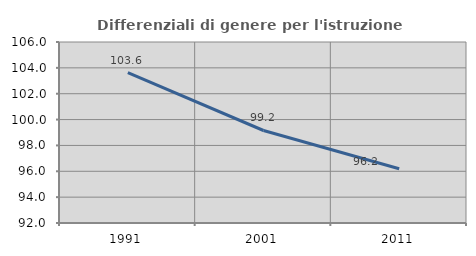
| Category | Differenziali di genere per l'istruzione superiore |
|---|---|
| 1991.0 | 103.632 |
| 2001.0 | 99.155 |
| 2011.0 | 96.196 |